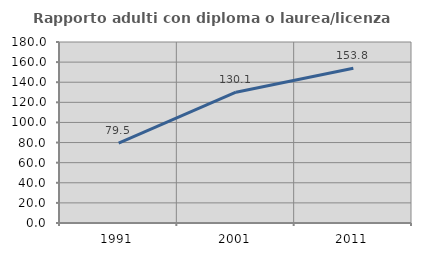
| Category | Rapporto adulti con diploma o laurea/licenza media  |
|---|---|
| 1991.0 | 79.454 |
| 2001.0 | 130.051 |
| 2011.0 | 153.819 |